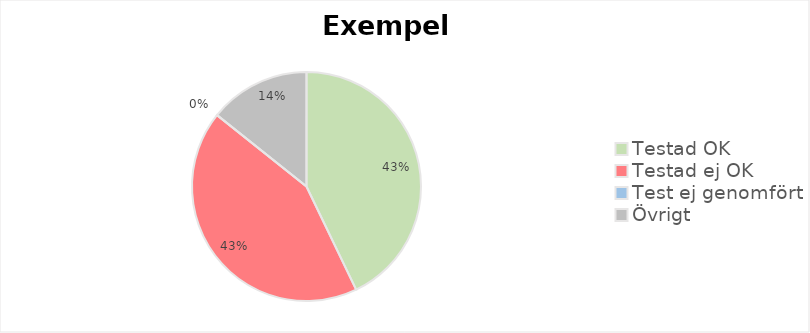
| Category | Series 0 |
|---|---|
| Testad OK | 3 |
| Testad ej OK | 3 |
| Test ej genomfört | 0 |
| Övrigt | 1 |